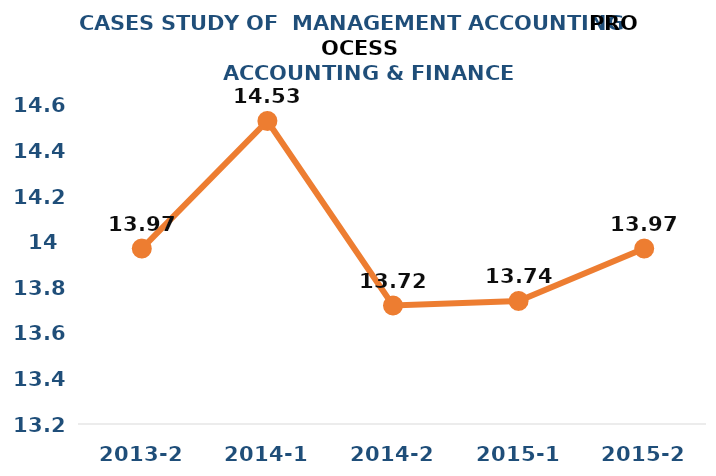
| Category | Series 0 |
|---|---|
| 2013-2 | 13.97 |
| 2014-1 | 14.53 |
| 2014-2 | 13.72 |
| 2015-1 | 13.74 |
| 2015-2 | 13.97 |